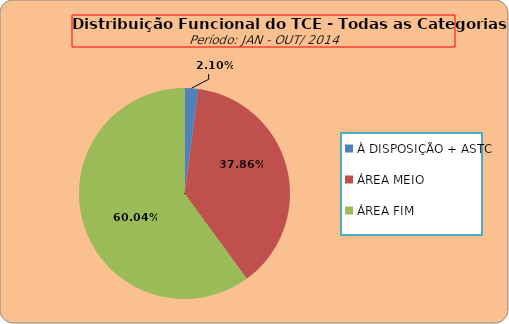
| Category | ÁREAS DE ATUAÇÃO |
|---|---|
| À DISPOSIÇÃO + ASTC | 11 |
| ÁREA MEIO | 198 |
| ÁREA FIM | 314 |